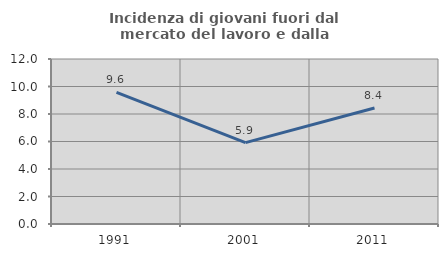
| Category | Incidenza di giovani fuori dal mercato del lavoro e dalla formazione  |
|---|---|
| 1991.0 | 9.576 |
| 2001.0 | 5.921 |
| 2011.0 | 8.44 |